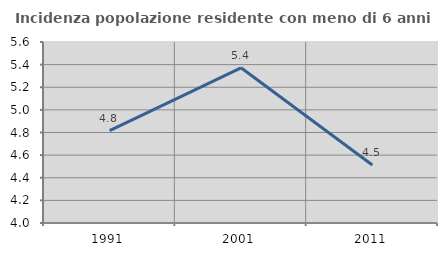
| Category | Incidenza popolazione residente con meno di 6 anni |
|---|---|
| 1991.0 | 4.817 |
| 2001.0 | 5.372 |
| 2011.0 | 4.513 |